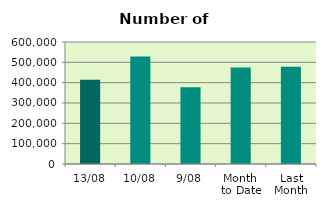
| Category | Series 0 |
|---|---|
| 13/08 | 414066 |
| 10/08 | 528514 |
| 9/08 | 377714 |
| Month 
to Date | 474139.111 |
| Last
Month | 477777.545 |